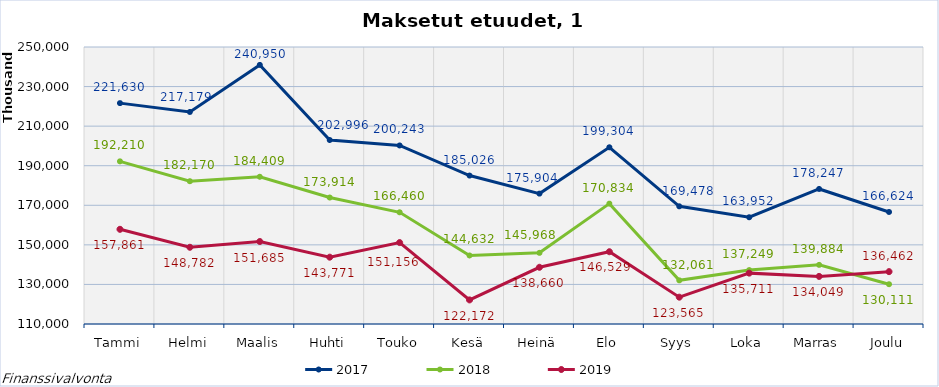
| Category | 2017 | 2018 | 2019 |
|---|---|---|---|
| Tammi | 221629795.13 | 192209651.13 | 157860522.1 |
| Helmi | 217178804.68 | 182170230.5 | 148782420.78 |
| Maalis | 240949872.27 | 184409256.42 | 151685034.64 |
| Huhti | 202995776.49 | 173913899.62 | 143770662.22 |
| Touko | 200243353.24 | 166460283.64 | 151155677.28 |
| Kesä | 185025907.74 | 144632482.81 | 122172092.73 |
| Heinä | 175904485.53 | 145968141.28 | 138659657.02 |
| Elo | 199303928.83 | 170833678.76 | 146528956.01 |
| Syys | 169477939 | 132061194.09 | 123565066.7 |
| Loka | 163951886.98 | 137248872.59 | 135710652.23 |
| Marras | 178247106.3 | 139884299.25 | 134048754.57 |
| Joulu | 166623966.85 | 130111199 | 136462254.42 |